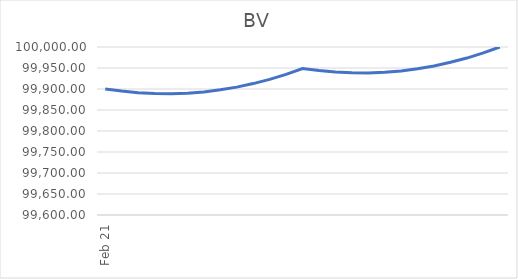
| Category | BV |
|---|---|
| 2021-02-01 | 99900 |
| 2021-03-01 | 99894.99 |
| 2021-04-01 | 99891.11 |
| 2021-05-01 | 99889.04 |
| 2021-06-01 | 99888.64 |
| 2021-07-01 | 99889.96 |
| 2021-08-01 | 99893.07 |
| 2021-09-01 | 99897.98 |
| 2021-10-01 | 99904.45 |
| 2021-11-01 | 99912.91 |
| 2021-12-01 | 99922.84 |
| 2022-01-01 | 99934.89 |
| 2022-02-01 | 99948.77 |
| 2022-03-01 | 99943.94 |
| 2022-04-01 | 99940.27 |
| 2022-05-01 | 99938.4 |
| 2022-06-01 | 99938.21 |
| 2022-07-01 | 99939.73 |
| 2022-08-01 | 99943.05 |
| 2022-09-01 | 99948.17 |
| 2022-10-01 | 99954.84 |
| 2022-11-01 | 99963.51 |
| 2022-12-01 | 99973.65 |
| 2023-01-01 | 99985.91 |
| 2023-02-01 | 100000 |